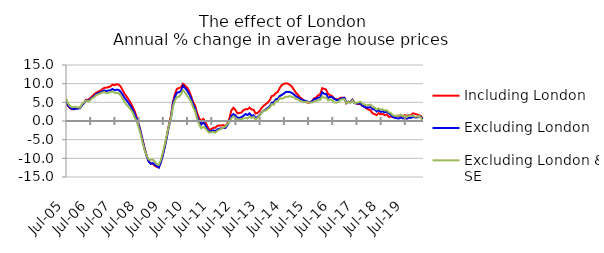
| Category | Including London | Excluding London | Excluding London & SE |
|---|---|---|---|
| 2005-07-01 | 5.042 | 5.34 | 6.041 |
| 2005-08-01 | 4.021 | 4.233 | 4.729 |
| 2005-09-01 | 3.44 | 3.609 | 4.031 |
| 2005-10-01 | 3.117 | 3.198 | 3.683 |
| 2005-11-01 | 3.119 | 3.179 | 3.804 |
| 2005-12-01 | 3.391 | 3.293 | 3.72 |
| 2006-01-01 | 3.46 | 3.314 | 3.632 |
| 2006-02-01 | 3.679 | 3.428 | 3.573 |
| 2006-03-01 | 4.36 | 4.288 | 4.578 |
| 2006-04-01 | 4.971 | 4.807 | 4.982 |
| 2006-05-01 | 5.703 | 5.549 | 5.472 |
| 2006-06-01 | 5.682 | 5.378 | 5.289 |
| 2006-07-01 | 6.13 | 5.818 | 5.553 |
| 2006-08-01 | 6.584 | 6.212 | 6.08 |
| 2006-09-01 | 7.141 | 6.725 | 6.422 |
| 2006-10-01 | 7.569 | 7.227 | 6.924 |
| 2006-11-01 | 7.9 | 7.477 | 7.14 |
| 2006-12-01 | 8.141 | 7.684 | 7.41 |
| 2007-01-01 | 8.527 | 7.906 | 7.62 |
| 2007-02-01 | 8.881 | 8.173 | 7.77 |
| 2007-03-01 | 8.911 | 8.019 | 7.457 |
| 2007-04-01 | 9.095 | 8.169 | 7.568 |
| 2007-05-01 | 9.213 | 8.204 | 7.716 |
| 2007-06-01 | 9.739 | 8.578 | 7.871 |
| 2007-07-01 | 9.603 | 8.264 | 7.598 |
| 2007-08-01 | 9.834 | 8.384 | 7.471 |
| 2007-09-01 | 9.759 | 8.353 | 7.476 |
| 2007-10-01 | 9.31 | 7.908 | 6.946 |
| 2007-11-01 | 8.338 | 7.116 | 6.089 |
| 2007-12-01 | 7.301 | 6.209 | 5.13 |
| 2008-01-01 | 6.594 | 5.569 | 4.358 |
| 2008-02-01 | 5.803 | 4.819 | 3.807 |
| 2008-03-01 | 4.897 | 4.031 | 3.135 |
| 2008-04-01 | 3.869 | 3.081 | 2.34 |
| 2008-05-01 | 2.669 | 1.982 | 1.042 |
| 2008-06-01 | 1.104 | 0.608 | -0.088 |
| 2008-07-01 | -0.68 | -0.992 | -1.674 |
| 2008-08-01 | -2.784 | -3 | -3.489 |
| 2008-09-01 | -5.142 | -5.294 | -5.824 |
| 2008-10-01 | -7.4 | -7.555 | -7.844 |
| 2008-11-01 | -9.283 | -9.376 | -9.246 |
| 2008-12-01 | -10.716 | -10.891 | -10.295 |
| 2009-01-01 | -11.416 | -11.431 | -10.399 |
| 2009-02-01 | -11.461 | -11.235 | -10.34 |
| 2009-03-01 | -11.986 | -11.748 | -10.864 |
| 2009-04-01 | -12.284 | -12.069 | -11.542 |
| 2009-05-01 | -12.391 | -12.497 | -11.751 |
| 2009-06-01 | -11.045 | -11.133 | -10.506 |
| 2009-07-01 | -9.035 | -9.204 | -8.454 |
| 2009-08-01 | -6.756 | -6.883 | -6.256 |
| 2009-09-01 | -3.959 | -4.358 | -3.813 |
| 2009-10-01 | -1.05 | -1.44 | -1.209 |
| 2009-11-01 | 1.332 | 0.762 | 0.706 |
| 2009-12-01 | 4.938 | 4.524 | 3.867 |
| 2010-01-01 | 7.185 | 6.538 | 5.474 |
| 2010-02-01 | 8.595 | 7.568 | 6.419 |
| 2010-03-01 | 8.825 | 7.698 | 6.489 |
| 2010-04-01 | 9.037 | 8.044 | 7.15 |
| 2010-05-01 | 9.954 | 9.479 | 8.277 |
| 2010-06-01 | 9.51 | 8.83 | 7.67 |
| 2010-07-01 | 8.98 | 8.233 | 6.814 |
| 2010-08-01 | 8.1 | 7.247 | 5.995 |
| 2010-09-01 | 6.68 | 6.17 | 5.224 |
| 2010-10-01 | 5.06 | 4.477 | 3.72 |
| 2010-11-01 | 4.111 | 3.455 | 2.686 |
| 2010-12-01 | 2.111 | 1.245 | 0.589 |
| 2011-01-01 | 0.812 | 0.009 | -0.813 |
| 2011-02-01 | -0.153 | -0.975 | -1.959 |
| 2011-03-01 | 0.561 | -0.352 | -1.604 |
| 2011-04-01 | -0.049 | -0.993 | -1.861 |
| 2011-05-01 | -1.337 | -2.104 | -2.603 |
| 2011-06-01 | -2.364 | -2.804 | -3.111 |
| 2011-07-01 | -2.193 | -2.71 | -3.015 |
| 2011-08-01 | -1.838 | -2.514 | -2.939 |
| 2011-09-01 | -1.815 | -2.702 | -3.127 |
| 2011-10-01 | -1.313 | -2.26 | -2.601 |
| 2011-11-01 | -1.193 | -2.051 | -2.33 |
| 2011-12-01 | -1.187 | -1.975 | -2.083 |
| 2012-01-01 | -1.1 | -1.808 | -1.74 |
| 2012-02-01 | -1.426 | -1.872 | -1.49 |
| 2012-03-01 | -0.66 | -1.074 | -0.763 |
| 2012-04-01 | 0.645 | -0.139 | -0.379 |
| 2012-05-01 | 2.851 | 1.385 | 0.785 |
| 2012-06-01 | 3.556 | 1.855 | 1.213 |
| 2012-07-01 | 2.98 | 1.48 | 0.842 |
| 2012-08-01 | 2.051 | 0.876 | 0.424 |
| 2012-09-01 | 2.183 | 0.85 | 0.325 |
| 2012-10-01 | 2.249 | 1.007 | 0.526 |
| 2012-11-01 | 2.896 | 1.405 | 0.672 |
| 2012-12-01 | 3.177 | 1.864 | 0.816 |
| 2013-01-01 | 3.149 | 1.614 | 0.648 |
| 2013-02-01 | 3.602 | 2.058 | 1.223 |
| 2013-03-01 | 3.097 | 1.383 | 0.768 |
| 2013-04-01 | 3.012 | 1.539 | 1.119 |
| 2013-05-01 | 1.998 | 0.817 | 0.37 |
| 2013-06-01 | 2.165 | 1.096 | 0.849 |
| 2013-07-01 | 2.664 | 1.622 | 1.488 |
| 2013-08-01 | 3.537 | 2.231 | 2.192 |
| 2013-09-01 | 4.062 | 2.809 | 2.824 |
| 2013-10-01 | 4.504 | 3.05 | 2.769 |
| 2013-11-01 | 4.904 | 3.489 | 3.256 |
| 2013-12-01 | 5.552 | 3.894 | 3.532 |
| 2014-01-01 | 6.672 | 4.881 | 4.507 |
| 2014-02-01 | 6.837 | 4.965 | 4.315 |
| 2014-03-01 | 7.485 | 5.784 | 5.271 |
| 2014-04-01 | 7.762 | 5.942 | 5.327 |
| 2014-05-01 | 8.89 | 6.699 | 6.153 |
| 2014-06-01 | 9.637 | 6.984 | 5.954 |
| 2014-07-01 | 9.951 | 7.361 | 6.199 |
| 2014-08-01 | 10.096 | 7.756 | 6.47 |
| 2014-09-01 | 10.007 | 7.805 | 6.464 |
| 2014-10-01 | 9.695 | 7.747 | 6.671 |
| 2014-11-01 | 9.213 | 7.531 | 6.418 |
| 2014-12-01 | 8.373 | 7.095 | 6.34 |
| 2015-01-01 | 7.547 | 6.647 | 5.856 |
| 2015-02-01 | 7.027 | 6.342 | 5.823 |
| 2015-03-01 | 6.305 | 5.908 | 5.404 |
| 2015-04-01 | 5.966 | 5.669 | 5.238 |
| 2015-05-01 | 5.412 | 5.482 | 5.073 |
| 2015-06-01 | 5.095 | 5.374 | 5.149 |
| 2015-07-01 | 4.873 | 5.112 | 5.019 |
| 2015-08-01 | 5.068 | 5.03 | 4.93 |
| 2015-09-01 | 5.314 | 5.251 | 4.922 |
| 2015-10-01 | 6.053 | 5.827 | 5.238 |
| 2015-11-01 | 6.264 | 5.939 | 5.358 |
| 2015-12-01 | 6.887 | 6.247 | 5.55 |
| 2016-01-01 | 7.107 | 6.314 | 5.615 |
| 2016-02-01 | 8.779 | 7.698 | 6.563 |
| 2016-03-01 | 8.635 | 7.291 | 6.253 |
| 2016-04-01 | 8.371 | 7.184 | 6.224 |
| 2016-05-01 | 7.156 | 6.181 | 5.489 |
| 2016-06-01 | 6.972 | 6.52 | 5.778 |
| 2016-07-01 | 6.659 | 6.355 | 5.535 |
| 2016-08-01 | 5.976 | 5.937 | 5.005 |
| 2016-09-01 | 5.835 | 5.644 | 4.902 |
| 2016-10-01 | 5.753 | 5.566 | 5.12 |
| 2016-11-01 | 6.201 | 5.946 | 5.677 |
| 2016-12-01 | 6.209 | 6.09 | 5.808 |
| 2017-01-01 | 6.212 | 6.218 | 5.846 |
| 2017-02-01 | 4.709 | 4.856 | 4.729 |
| 2017-03-01 | 5.087 | 5.218 | 5.135 |
| 2017-04-01 | 5.037 | 4.991 | 4.884 |
| 2017-05-01 | 5.713 | 5.63 | 5.481 |
| 2017-06-01 | 4.922 | 4.802 | 4.805 |
| 2017-07-01 | 4.694 | 4.681 | 4.875 |
| 2017-08-01 | 4.548 | 4.66 | 4.997 |
| 2017-09-01 | 4.546 | 4.661 | 5.149 |
| 2017-10-01 | 4.045 | 4.097 | 4.617 |
| 2017-11-01 | 3.801 | 3.778 | 4.397 |
| 2017-12-01 | 3.345 | 3.572 | 4.193 |
| 2018-01-01 | 3.076 | 3.616 | 4.283 |
| 2018-02-01 | 2.85 | 3.709 | 4.383 |
| 2018-03-01 | 2.045 | 3.175 | 3.754 |
| 2018-04-01 | 1.853 | 3.127 | 3.645 |
| 2018-05-01 | 1.563 | 2.563 | 3.05 |
| 2018-06-01 | 2.107 | 2.876 | 3.381 |
| 2018-07-01 | 1.779 | 2.45 | 3.027 |
| 2018-08-01 | 1.905 | 2.582 | 3.154 |
| 2018-09-01 | 1.567 | 2.333 | 2.802 |
| 2018-10-01 | 1.769 | 2.521 | 2.902 |
| 2018-11-01 | 1.108 | 2.039 | 2.339 |
| 2018-12-01 | 1.218 | 1.68 | 2.15 |
| 2019-01-01 | 1.039 | 1.087 | 1.559 |
| 2019-02-01 | 1.291 | 0.867 | 1.396 |
| 2019-03-01 | 1.383 | 0.758 | 1.331 |
| 2019-04-01 | 1.363 | 0.666 | 1.457 |
| 2019-05-01 | 1.53 | 0.946 | 1.727 |
| 2019-06-01 | 1.277 | 0.7 | 1.265 |
| 2019-07-01 | 1.582 | 0.918 | 1.376 |
| 2019-08-01 | 1.382 | 0.606 | 1.071 |
| 2019-09-01 | 1.572 | 0.891 | 1.504 |
| 2019-10-01 | 1.471 | 0.811 | 1.33 |
| 2019-11-01 | 2.06 | 1.104 | 1.477 |
| 2019-12-01 | 1.922 | 0.963 | 1.143 |
| 2020-01-01 | 1.736 | 0.945 | 1.121 |
| 2020-02-01 | 1.592 | 1.227 | 1.37 |
| 2020-03-01 | 1.292 | 1.048 | 0.855 |
| 2020-04-01 | 0.456 | 0.39 | -0.134 |